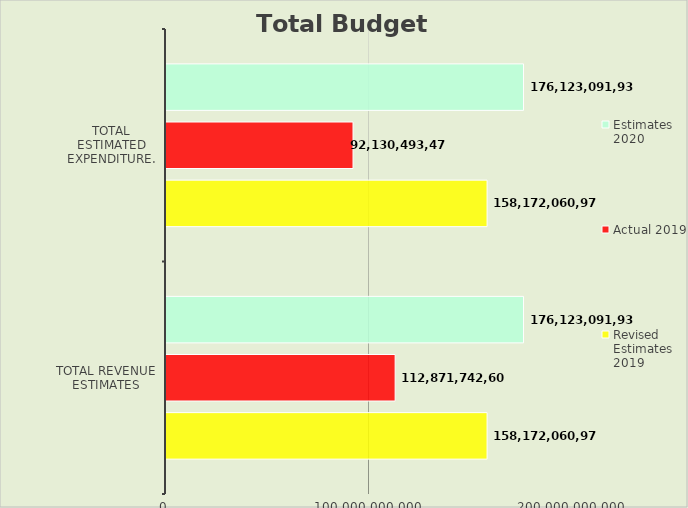
| Category | Revised Estimates 2019 | Actual 2019 | Estimates 2020 |
|---|---|---|---|
| TOTAL REVENUE ESTIMATES | 158172060971 | 112871742601 | 176123091931.498 |
| TOTAL ESTIMATED EXPENDITURE. | 158172060971 | 92130493478.42 | 176123091931.498 |